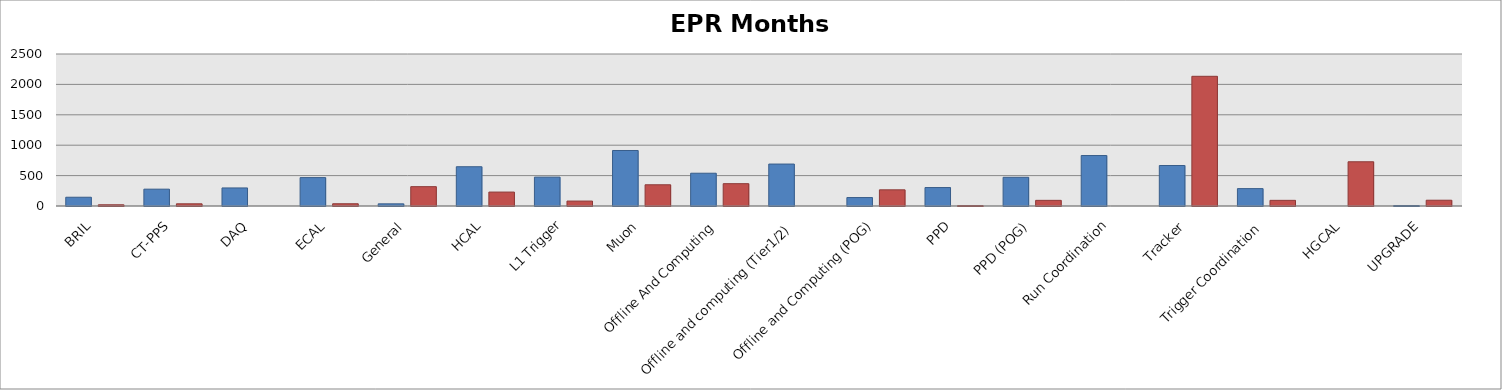
| Category | Core months | Non-core months |
|---|---|---|
| BRIL | 144 | 20 |
| CT-PPS | 277 | 36 |
| DAQ | 297 | 0 |
| ECAL | 467 | 37 |
| General | 35.5 | 318 |
| HCAL | 646 | 229 |
| L1 Trigger | 475 | 81 |
| Muon | 913 | 349 |
| Offline And Computing | 539 | 367 |
| Offline and computing (Tier1/2) | 690 | 0 |
| Offline and Computing (POG) | 139 | 266 |
| PPD | 303.5 | 6 |
| PPD (POG) | 472 | 93 |
| Run Coordination | 830 | 0 |
| Tracker | 666 | 2133.2 |
| Trigger Coordination | 286 | 93 |
| HGCAL | 0 | 727.5 |
| UPGRADE | 7.5 | 95 |